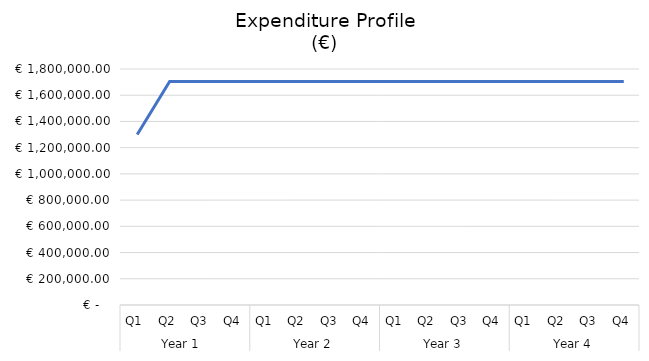
| Category | Cumulative Expenditure 
(€) |
|---|---|
| 0 | 1300000 |
| 1 | 1704253.74 |
| 2 | 1704253.74 |
| 3 | 1704253.74 |
| 4 | 1704253.74 |
| 5 | 1704253.74 |
| 6 | 1704253.74 |
| 7 | 1704253.74 |
| 8 | 1704253.74 |
| 9 | 1704253.74 |
| 10 | 1704253.74 |
| 11 | 1704253.74 |
| 12 | 1704253.74 |
| 13 | 1704253.74 |
| 14 | 1704253.74 |
| 15 | 1704253.74 |